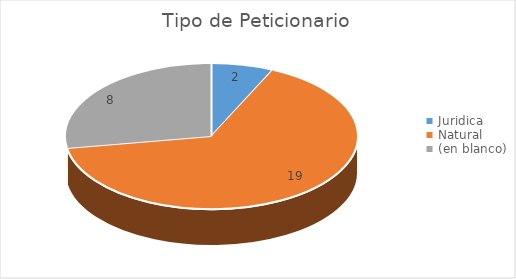
| Category | Total |
|---|---|
| Juridica | 2 |
| Natural | 19 |
| (en blanco) | 8 |